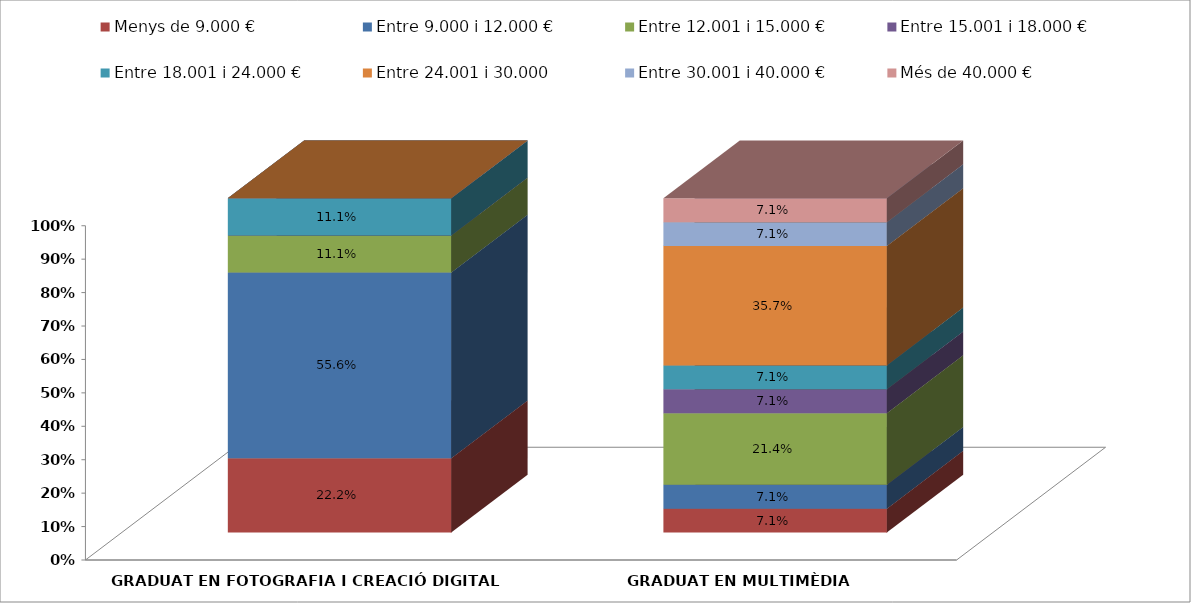
| Category | Menys de 9.000 € | Entre 9.000 i 12.000 € | Entre 12.001 i 15.000 € | Entre 15.001 i 18.000 € | Entre 18.001 i 24.000 € | Entre 24.001 i 30.000 | Entre 30.001 i 40.000 € | Més de 40.000 € |
|---|---|---|---|---|---|---|---|---|
| GRADUAT EN FOTOGRAFIA I CREACIÓ DIGITAL | 0.222 | 0.556 | 0.111 | 0 | 0.111 | 0 | 0 | 0 |
| GRADUAT EN MULTIMÈDIA | 0.071 | 0.071 | 0.214 | 0.071 | 0.071 | 0.357 | 0.071 | 0.071 |